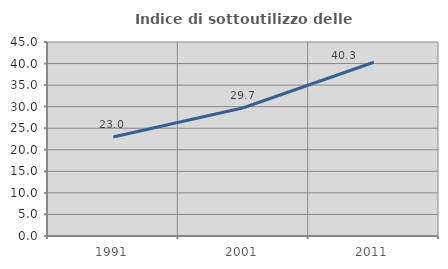
| Category | Indice di sottoutilizzo delle abitazioni  |
|---|---|
| 1991.0 | 22.966 |
| 2001.0 | 29.748 |
| 2011.0 | 40.294 |